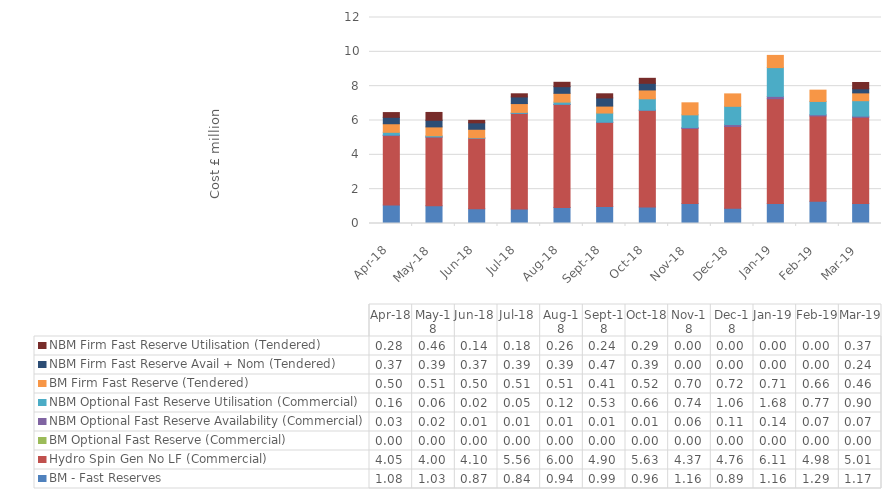
| Category | BM - Fast Reserves | Hydro Spin Gen No LF (Commercial) | BM Optional Fast Reserve (Commercial) | NBM Optional Fast Reserve Availability (Commercial) | NBM Optional Fast Reserve Utilisation (Commercial) | BM Firm Fast Reserve (Tendered) | NBM Firm Fast Reserve Avail + Nom (Tendered) | NBM Firm Fast Reserve Utilisation (Tendered) |
|---|---|---|---|---|---|---|---|---|
| 2018-04-30 | 1.077 | 4.045 | 0 | 0.033 | 0.157 | 0.499 | 0.374 | 0.276 |
| 2018-05-31 | 1.033 | 4.001 | 0 | 0.015 | 0.063 | 0.515 | 0.387 | 0.455 |
| 2018-06-30 | 0.865 | 4.101 | 0 | 0.005 | 0.023 | 0.495 | 0.374 | 0.144 |
| 2018-07-31 | 0.842 | 5.565 | 0 | 0.014 | 0.052 | 0.514 | 0.387 | 0.182 |
| 2018-08-31 | 0.937 | 6.002 | 0 | 0.009 | 0.122 | 0.514 | 0.387 | 0.255 |
| 2018-09-30 | 0.989 | 4.902 | 0 | 0.013 | 0.53 | 0.406 | 0.474 | 0.242 |
| 2018-10-31 | 0.959 | 5.634 | 0 | 0.01 | 0.661 | 0.515 | 0.387 | 0.291 |
| 2018-11-30 | 1.16 | 4.374 | 0 | 0.061 | 0.736 | 0.7 | 0 | 0 |
| 2018-12-31 | 0.894 | 4.761 | 0 | 0.109 | 1.063 | 0.724 | 0 | 0 |
| 2019-01-31 | 1.162 | 6.107 | 0 | 0.136 | 1.675 | 0.712 | 0 | 0 |
| 2019-02-28 | 1.291 | 4.976 | 0 | 0.069 | 0.775 | 0.658 | 0 | 0 |
| 2019-03-31 | 1.172 | 5.012 | 0 | 0.071 | 0.899 | 0.455 | 0.239 | 0.368 |